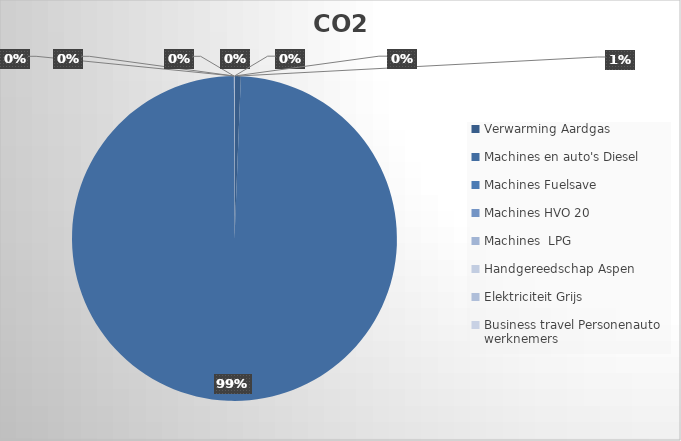
| Category | Ton CO2 | Series 1 |
|---|---|---|
| 0 | 4.572 |  |
| 1 | 723.46 |  |
| 2 | 0 |  |
| 3 | 0 |  |
| 4 | 0 |  |
| 5 | 0.409 |  |
| 6 | 0 |  |
| 7 | 0 |  |